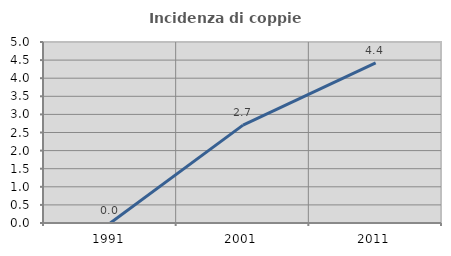
| Category | Incidenza di coppie miste |
|---|---|
| 1991.0 | 0 |
| 2001.0 | 2.703 |
| 2011.0 | 4.425 |